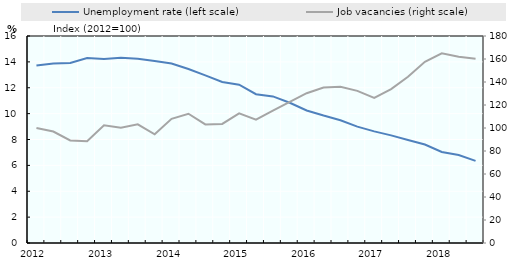
| Category | Unemployment rate (left scale) |
|---|---|
| 2012.0 | 13.714 |
| nan | 13.874 |
| nan | 13.908 |
| nan | 14.298 |
| 2013.0 | 14.228 |
| nan | 14.326 |
| nan | 14.238 |
| nan | 14.074 |
| 2014.0 | 13.871 |
| nan | 13.447 |
| nan | 12.956 |
| nan | 12.444 |
| 2015.0 | 12.24 |
| nan | 11.498 |
| nan | 11.329 |
| nan | 10.842 |
| 2016.0 | 10.243 |
| nan | 9.851 |
| nan | 9.491 |
| nan | 8.997 |
| 2017.0 | 8.63 |
| nan | 8.319 |
| nan | 7.96 |
| nan | 7.613 |
| 2018.0 | 7.038 |
| nan | 6.795 |
| nan | 6.35 |